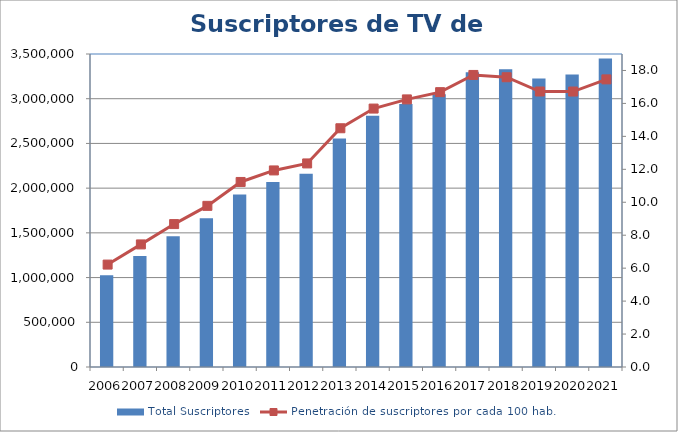
| Category | Total Suscriptores |
|---|---|
| 0 | 1026667 |
| 1 | 1241346 |
| 2 | 1461490 |
| 3 | 1664032 |
| 4 | 1928694 |
| 5 | 2067368 |
| 6 | 2159979 |
| 7 | 2555620 |
| 8 | 2809981 |
| 9 | 2940023 |
| 10 | 3050347 |
| 11 | 3294954 |
| 12 | 3329543 |
| 13 | 3224710 |
| 14 | 3272022 |
| 15 | 3448808 |